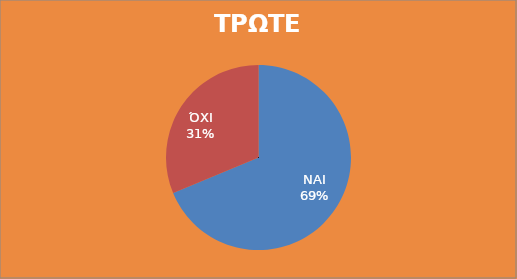
| Category | ΠΑΙΔΙΑ |
|---|---|
| ΝΑΙ | 123 |
| ΌΧΙ | 56 |